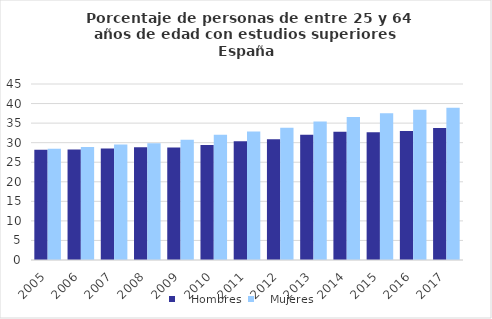
| Category |    Hombres |    Mujeres |
|---|---|---|
| 2005.0 | 28.195 | 28.449 |
| 2006.0 | 28.229 | 28.913 |
| 2007.0 | 28.527 | 29.529 |
| 2008.0 | 28.802 | 29.824 |
| 2009.0 | 28.781 | 30.719 |
| 2010.0 | 29.386 | 32.045 |
| 2011.0 | 30.341 | 32.868 |
| 2012.0 | 30.89 | 33.809 |
| 2013.0 | 32.048 | 35.43 |
| 2014.0 | 32.813 | 36.547 |
| 2015.0 | 32.656 | 37.506 |
| 2016.0 | 32.982 | 38.398 |
| 2017.0 | 33.755 | 38.934 |